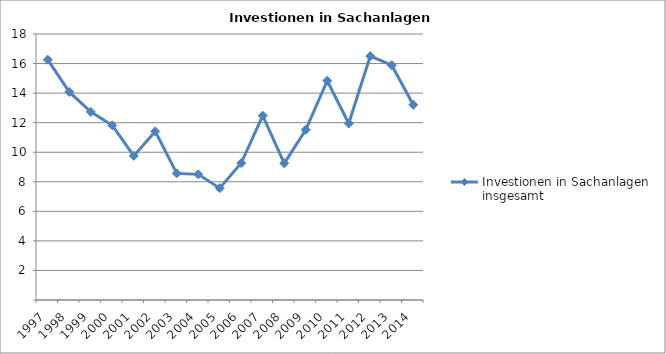
| Category | Investionen in Sachanlagen insgesamt |
|---|---|
| 1997.0 | 16.261 |
| 1998.0 | 14.078 |
| 1999.0 | 12.731 |
| 2000.0 | 11.822 |
| 2001.0 | 9.752 |
| 2002.0 | 11.408 |
| 2003.0 | 8.567 |
| 2004.0 | 8.502 |
| 2005.0 | 7.569 |
| 2006.0 | 9.268 |
| 2007.0 | 12.474 |
| 2008.0 | 9.251 |
| 2009.0 | 11.52 |
| 2010.0 | 14.838 |
| 2011.0 | 11.944 |
| 2012.0 | 16.506 |
| 2013.0 | 15.886 |
| 2014.0 | 13.207 |